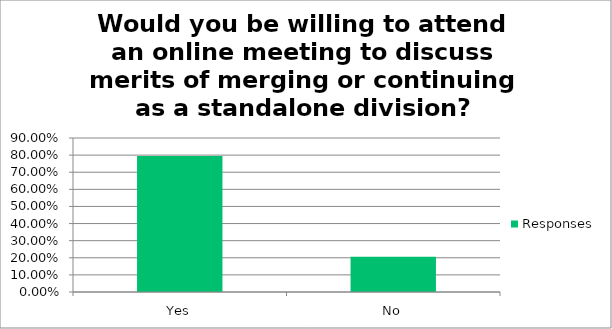
| Category | Responses |
|---|---|
| Yes | 0.794 |
| No | 0.206 |